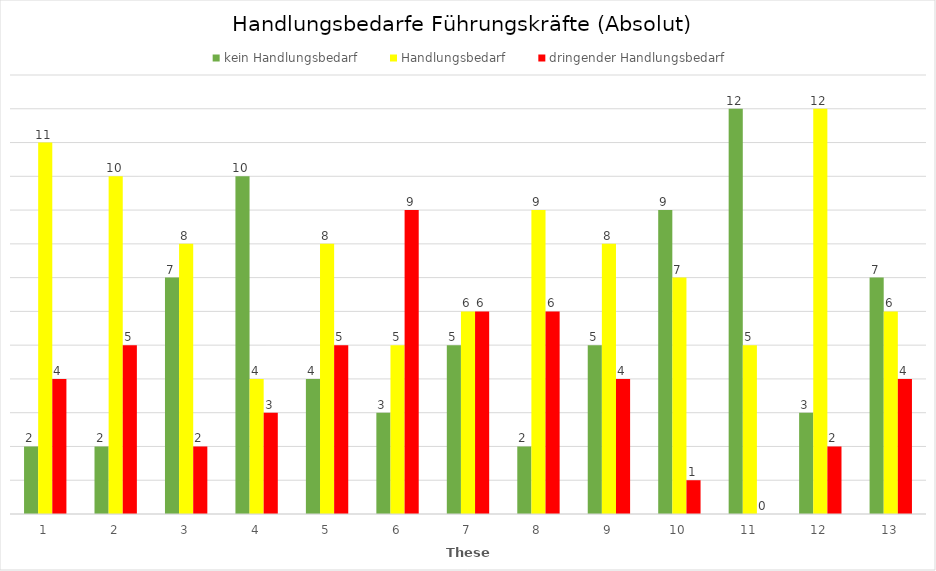
| Category | kein Handlungsbedarf | Handlungsbedarf | dringender Handlungsbedarf |
|---|---|---|---|
| 1.0 | 2 | 11 | 4 |
| 2.0 | 2 | 10 | 5 |
| 3.0 | 7 | 8 | 2 |
| 4.0 | 10 | 4 | 3 |
| 5.0 | 4 | 8 | 5 |
| 6.0 | 3 | 5 | 9 |
| 7.0 | 5 | 6 | 6 |
| 8.0 | 2 | 9 | 6 |
| 9.0 | 5 | 8 | 4 |
| 10.0 | 9 | 7 | 1 |
| 11.0 | 12 | 5 | 0 |
| 12.0 | 3 | 12 | 2 |
| 13.0 | 7 | 6 | 4 |